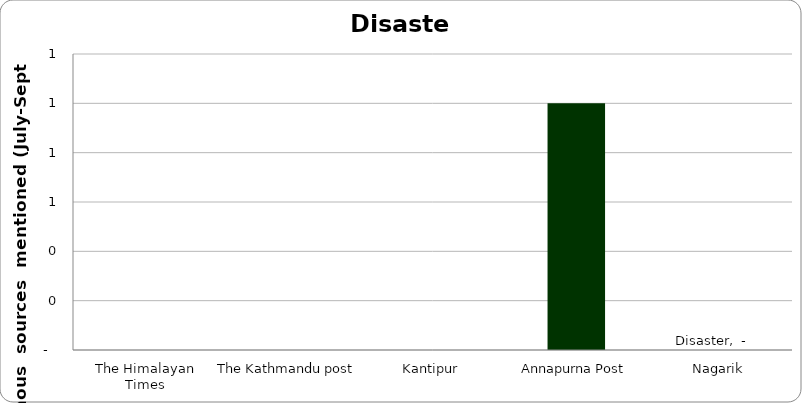
| Category | Disaster |
|---|---|
| The Himalayan Times | 0 |
| The Kathmandu post | 0 |
| Kantipur | 0 |
| Annapurna Post | 1 |
| Nagarik | 0 |